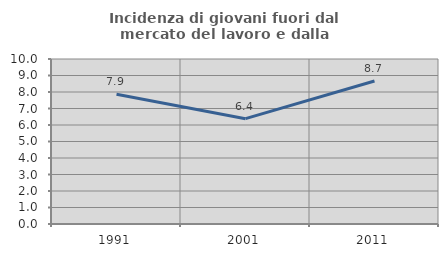
| Category | Incidenza di giovani fuori dal mercato del lavoro e dalla formazione  |
|---|---|
| 1991.0 | 7.86 |
| 2001.0 | 6.383 |
| 2011.0 | 8.667 |